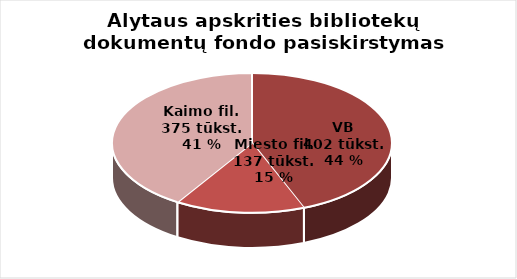
| Category | Series 0 |
|---|---|
| VB | 401708 |
| Miesto filialuose | 136749 |
| Kaimo filialuose | 375363 |